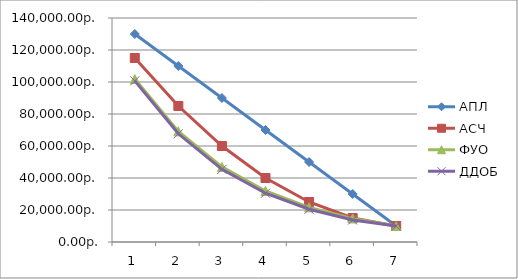
| Category | АПЛ | АСЧ | ФУО | ДДОБ |
|---|---|---|---|---|
| 0 | 130000 | 115000 | 101850 | 100714.286 |
| 1 | 110000 | 85000 | 69156.15 | 67622.449 |
| 2 | 90000 | 60000 | 46957.026 | 45403.644 |
| 3 | 70000 | 40000 | 31883.821 | 30485.304 |
| 4 | 50000 | 25000 | 21649.114 | 20468.704 |
| 5 | 30000 | 15000 | 14699.749 | 13743.273 |
| 6 | 10000 | 10000 | 9981.129 | 10000 |